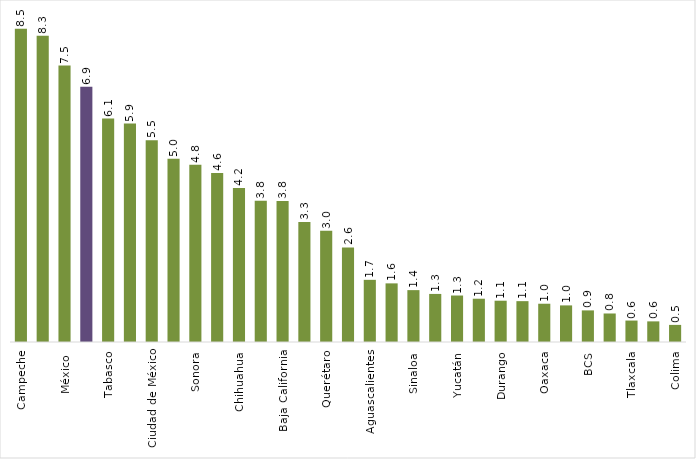
| Category | Series 0 |
|---|---|
| Campeche | 8.495 |
| Nuevo León | 8.303 |
| México  | 7.492 |
| Jalisco | 6.918 |
| Tabasco | 6.058 |
| Coahuila de Zaragoza | 5.923 |
| Ciudad de México | 5.47 |
| Guanajuato | 4.969 |
| Sonora | 4.804 |
| Veracruz | 4.579 |
| Chihuahua | 4.174 |
| Puebla | 3.83 |
| Baja California | 3.821 |
| Tamaulipas | 3.252 |
| Querétaro | 3.014 |
| San Luis Potosí | 2.564 |
| Aguascalientes | 1.685 |
| Hidalgo | 1.589 |
| Sinaloa | 1.406 |
| Michoacán | 1.303 |
| Yucatán | 1.26 |
| Morelos | 1.173 |
| Durango | 1.119 |
| Chiapas | 1.107 |
| Oaxaca | 1.037 |
| Zacatecas | 0.992 |
| BCS | 0.857 |
| Guerrero | 0.773 |
| Tlaxcala | 0.581 |
| Quintana Roo | 0.559 |
| Colima | 0.464 |